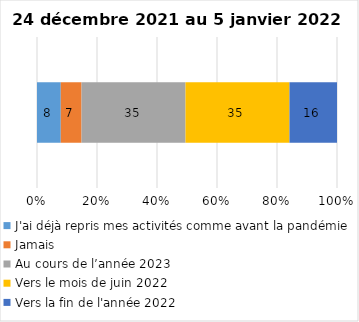
| Category | J'ai déjà repris mes activités comme avant la pandémie | Jamais | Au cours de l’année 2023 | Vers le mois de juin 2022 | Vers la fin de l'année 2022 |
|---|---|---|---|---|---|
| 0 | 8 | 7 | 35 | 35 | 16 |